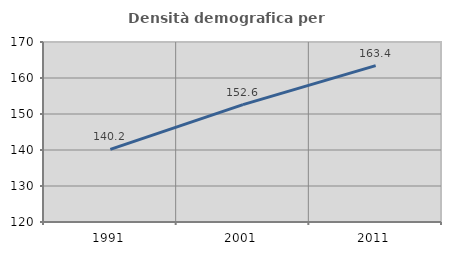
| Category | Densità demografica |
|---|---|
| 1991.0 | 140.189 |
| 2001.0 | 152.616 |
| 2011.0 | 163.444 |